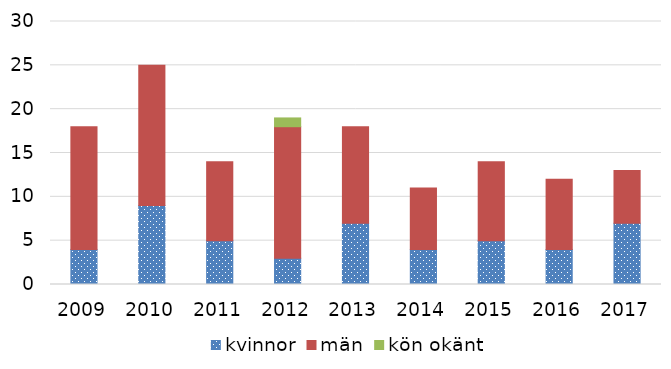
| Category | kvinnor | män | kön okänt |
|---|---|---|---|
| 2009 | 4 | 14 | 0 |
| 2010 | 9 | 16 | 0 |
| 2011 | 5 | 9 | 0 |
| 2012 | 3 | 15 | 1 |
| 2013 | 7 | 11 | 0 |
| 2014 | 4 | 7 | 0 |
| 2015 | 5 | 9 | 0 |
| 2016 | 4 | 8 | 0 |
| 2017 | 7 | 6 | 0 |